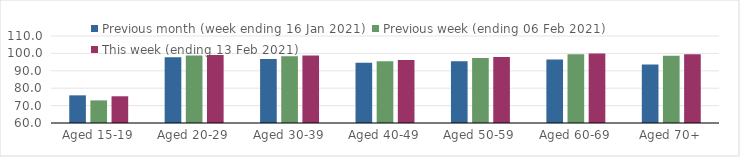
| Category | Previous month (week ending 16 Jan 2021) | Previous week (ending 06 Feb 2021) | This week (ending 13 Feb 2021) |
|---|---|---|---|
| Aged 15-19 | 75.89 | 73 | 75.36 |
| Aged 20-29 | 97.79 | 98.77 | 99.14 |
| Aged 30-39 | 96.72 | 98.38 | 98.77 |
| Aged 40-49 | 94.57 | 95.5 | 96.25 |
| Aged 50-59 | 95.5 | 97.39 | 97.92 |
| Aged 60-69 | 96.56 | 99.46 | 99.99 |
| Aged 70+ | 93.61 | 98.68 | 99.54 |